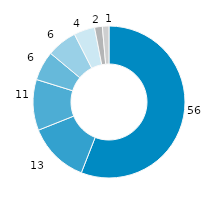
| Category | Hamburg |
|---|---|
| gesetzliche
Kranken-versicherung | 55.945 |
| private Haushalte u. private Organi-sationen o. E. | 13.021 |
| private
Kranken-versicherung | 10.834 |
| soziale Pflegeversicherung | 6.268 |
| öffentliche Haushalte | 6.445 |
| Arbeitgeber | 4.448 |
| gesetzliche Unfallversicherung | 1.659 |
| gesetzliche
Renten-
versicherung | 1.395 |